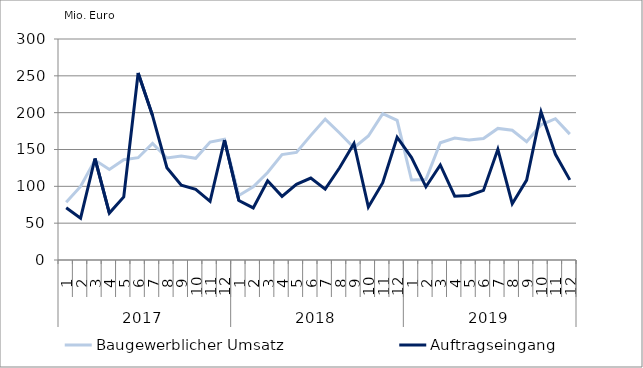
| Category | Baugewerblicher Umsatz | Auftragseingang |
|---|---|---|
| 0 | 78446.78 | 70908.903 |
| 1 | 99841.908 | 56868.408 |
| 2 | 135679.867 | 137790.423 |
| 3 | 123004.403 | 63637.761 |
| 4 | 136010.071 | 85644.63 |
| 5 | 138859.308 | 253791.552 |
| 6 | 158353.879 | 196034.198 |
| 7 | 138510.315 | 125319.873 |
| 8 | 141109.925 | 101690.626 |
| 9 | 138067.098 | 95966.626 |
| 10 | 160064.454 | 79701.993 |
| 11 | 163969.017 | 162878.607 |
| 12 | 87640.529 | 80684.627 |
| 13 | 99259.455 | 70746.763 |
| 14 | 118764.324 | 107538.747 |
| 15 | 143144.178 | 86374.619 |
| 16 | 146070.782 | 102661.329 |
| 17 | 169150.753 | 111287.709 |
| 18 | 191277.885 | 96286.662 |
| 19 | 172425.535 | 125142.495 |
| 20 | 152354.98 | 158112.302 |
| 21 | 168372.756 | 71808.619 |
| 22 | 198558.472 | 104904.147 |
| 23 | 189665.914 | 166653.461 |
| 24 | 108616.605 | 139065.287 |
| 25 | 109331.58 | 99318.609 |
| 26 | 159117.81 | 129002.041 |
| 27 | 165654.287 | 86579.2 |
| 28 | 162976.056 | 87644.362 |
| 29 | 165026.188 | 94463.186 |
| 30 | 178622.938 | 150345.08 |
| 31 | 176074.101 | 76434.317 |
| 32 | 160663.041 | 108444.162 |
| 33 | 183589.485 | 201122.697 |
| 34 | 191777.213 | 143514.792 |
| 35 | 170885.223 | 108780.022 |